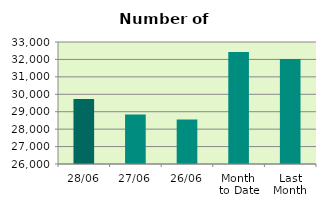
| Category | Series 0 |
|---|---|
| 28/06 | 29724 |
| 27/06 | 28834 |
| 26/06 | 28556 |
| Month 
to Date | 32421.5 |
| Last
Month | 32020.364 |